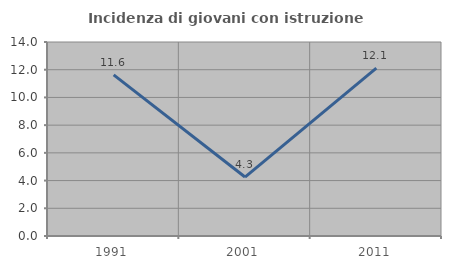
| Category | Incidenza di giovani con istruzione universitaria |
|---|---|
| 1991.0 | 11.628 |
| 2001.0 | 4.255 |
| 2011.0 | 12.121 |